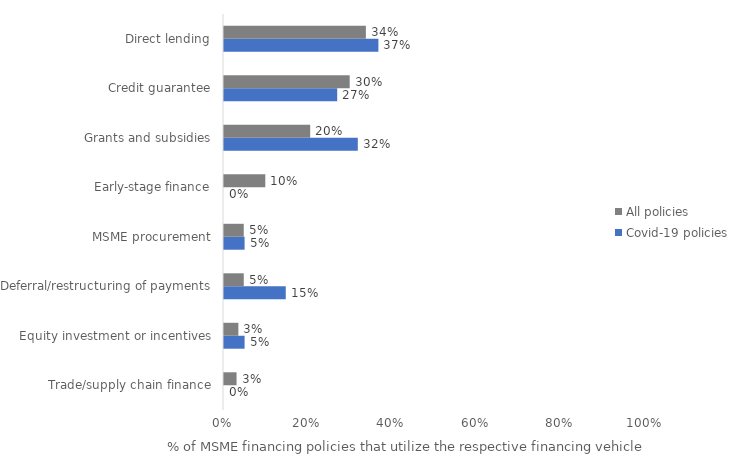
| Category | Covid-19 policies | All policies |
|---|---|---|
| Trade/supply chain finance | 0 | 0.03 |
| Equity investment or incentives | 0.049 | 0.034 |
| Deferral/restructuring of payments | 0.146 | 0.047 |
| MSME procurement | 0.049 | 0.047 |
| Early-stage finance | 0 | 0.098 |
| Grants and subsidies | 0.317 | 0.204 |
| Credit guarantee | 0.268 | 0.298 |
| Direct lending | 0.366 | 0.336 |